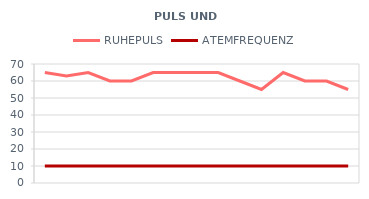
| Category | RUHEPULS | ATEMFREQUENZ |
|---|---|---|
| 6/1/12 | 65 | 10 |
| 6/2/12 | 63 | 10 |
| 6/3/12 | 65 | 10 |
| 6/4/12 | 60 | 10 |
| 6/5/12 | 60 | 10 |
| 6/6/12 | 65 | 10 |
| 6/7/12 | 65 | 10 |
| 6/8/12 | 65 | 10 |
| 6/9/12 | 65 | 10 |
| 6/10/12 | 60 | 10 |
| 6/11/12 | 55 | 10 |
| 6/12/12 | 65 | 10 |
| 6/13/12 | 60 | 10 |
| 6/14/12 | 60 | 10 |
| 6/15/12 | 55 | 10 |